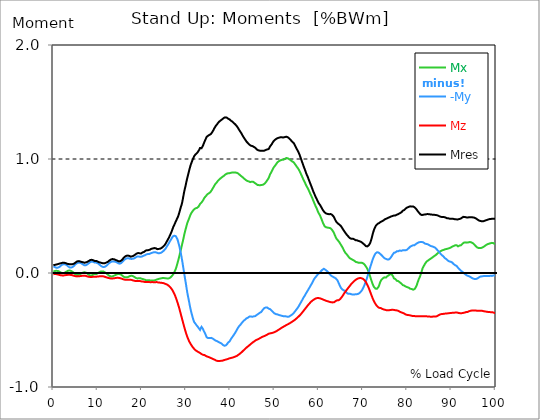
| Category |  Mx |  -My |  Mz |  Mres |
|---|---|---|---|---|
| 0.0 | 0.012 | 0.059 | -0.011 | 0.069 |
| 0.167348456675344 | 0.015 | 0.055 | -0.01 | 0.07 |
| 0.334696913350688 | 0.018 | 0.052 | -0.008 | 0.071 |
| 0.5020453700260321 | 0.019 | 0.049 | -0.01 | 0.073 |
| 0.669393826701376 | 0.019 | 0.046 | -0.01 | 0.074 |
| 0.83674228337672 | 0.02 | 0.045 | -0.011 | 0.074 |
| 1.0040907400520642 | 0.018 | 0.047 | -0.013 | 0.077 |
| 1.1621420602454444 | 0.016 | 0.049 | -0.015 | 0.081 |
| 1.3294905169207885 | 0.013 | 0.052 | -0.017 | 0.082 |
| 1.4968389735961325 | 0.008 | 0.058 | -0.019 | 0.083 |
| 1.6641874302714765 | 0.004 | 0.064 | -0.02 | 0.085 |
| 1.8315358869468206 | 0.001 | 0.069 | -0.021 | 0.087 |
| 1.9988843436221646 | -0.002 | 0.073 | -0.021 | 0.089 |
| 2.1662328002975086 | -0.002 | 0.075 | -0.021 | 0.09 |
| 2.333581256972853 | -0.001 | 0.077 | -0.021 | 0.09 |
| 2.5009297136481967 | 0.002 | 0.076 | -0.02 | 0.089 |
| 2.6682781703235405 | 0.005 | 0.076 | -0.019 | 0.088 |
| 2.8356266269988843 | 0.008 | 0.074 | -0.018 | 0.086 |
| 3.002975083674229 | 0.013 | 0.07 | -0.017 | 0.083 |
| 3.1703235403495724 | 0.017 | 0.066 | -0.016 | 0.081 |
| 3.337671997024917 | 0.02 | 0.058 | -0.016 | 0.079 |
| 3.4957233172182973 | 0.022 | 0.053 | -0.015 | 0.079 |
| 3.663071773893641 | 0.022 | 0.049 | -0.016 | 0.077 |
| 3.8304202305689854 | 0.021 | 0.047 | -0.016 | 0.076 |
| 3.997768687244329 | 0.018 | 0.048 | -0.017 | 0.076 |
| 4.165117143919673 | 0.015 | 0.05 | -0.019 | 0.076 |
| 4.332465600595017 | 0.011 | 0.052 | -0.02 | 0.077 |
| 4.499814057270361 | 0.005 | 0.057 | -0.022 | 0.08 |
| 4.667162513945706 | 0 | 0.063 | -0.024 | 0.082 |
| 4.834510970621049 | -0.006 | 0.069 | -0.025 | 0.087 |
| 5.001859427296393 | -0.012 | 0.076 | -0.028 | 0.091 |
| 5.169207883971737 | -0.015 | 0.081 | -0.029 | 0.097 |
| 5.336556340647081 | -0.017 | 0.086 | -0.03 | 0.101 |
| 5.503904797322425 | -0.018 | 0.089 | -0.03 | 0.103 |
| 5.671253253997769 | -0.017 | 0.091 | -0.029 | 0.104 |
| 5.82930457419115 | -0.014 | 0.09 | -0.029 | 0.103 |
| 5.996653030866494 | -0.011 | 0.089 | -0.028 | 0.102 |
| 6.164001487541838 | -0.007 | 0.087 | -0.027 | 0.1 |
| 6.331349944217181 | -0.003 | 0.085 | -0.025 | 0.098 |
| 6.498698400892526 | 0 | 0.081 | -0.024 | 0.096 |
| 6.66604685756787 | 0.003 | 0.075 | -0.023 | 0.094 |
| 6.833395314243213 | 0.005 | 0.071 | -0.023 | 0.092 |
| 7.000743770918558 | 0.006 | 0.068 | -0.023 | 0.09 |
| 7.168092227593902 | 0.006 | 0.067 | -0.024 | 0.09 |
| 7.335440684269246 | 0.004 | 0.068 | -0.025 | 0.092 |
| 7.50278914094459 | 0 | 0.071 | -0.028 | 0.094 |
| 7.6701375976199335 | -0.005 | 0.075 | -0.03 | 0.098 |
| 7.837486054295278 | -0.011 | 0.08 | -0.031 | 0.101 |
| 7.995537374488658 | -0.015 | 0.085 | -0.033 | 0.105 |
| 8.162885831164003 | -0.019 | 0.091 | -0.034 | 0.109 |
| 8.330234287839346 | -0.022 | 0.096 | -0.035 | 0.114 |
| 8.49758274451469 | -0.022 | 0.099 | -0.035 | 0.116 |
| 8.664931201190035 | -0.02 | 0.1 | -0.035 | 0.116 |
| 8.832279657865378 | -0.018 | 0.1 | -0.034 | 0.116 |
| 8.999628114540721 | -0.015 | 0.098 | -0.033 | 0.113 |
| 9.166976571216066 | -0.011 | 0.094 | -0.032 | 0.109 |
| 9.334325027891412 | -0.008 | 0.091 | -0.032 | 0.106 |
| 9.501673484566755 | -0.011 | 0.091 | -0.033 | 0.106 |
| 9.669021941242098 | -0.011 | 0.091 | -0.033 | 0.106 |
| 9.836370397917442 | -0.006 | 0.089 | -0.032 | 0.103 |
| 10.003718854592787 | -0.003 | 0.086 | -0.031 | 0.101 |
| 10.17106731126813 | 0.001 | 0.082 | -0.031 | 0.098 |
| 10.329118631461512 | 0.005 | 0.077 | -0.03 | 0.094 |
| 10.496467088136853 | 0.01 | 0.071 | -0.029 | 0.092 |
| 10.663815544812199 | 0.013 | 0.065 | -0.028 | 0.091 |
| 10.831164001487544 | 0.013 | 0.061 | -0.029 | 0.089 |
| 10.998512458162887 | 0.014 | 0.056 | -0.029 | 0.087 |
| 11.16586091483823 | 0.014 | 0.053 | -0.029 | 0.086 |
| 11.333209371513574 | 0.013 | 0.052 | -0.03 | 0.085 |
| 11.50055782818892 | 0.01 | 0.052 | -0.032 | 0.085 |
| 11.667906284864264 | 0.005 | 0.055 | -0.034 | 0.086 |
| 11.835254741539607 | 0.001 | 0.059 | -0.036 | 0.089 |
| 12.00260319821495 | -0.003 | 0.064 | -0.038 | 0.092 |
| 12.169951654890292 | -0.008 | 0.069 | -0.04 | 0.096 |
| 12.337300111565641 | -0.015 | 0.075 | -0.042 | 0.099 |
| 12.504648568240984 | -0.021 | 0.082 | -0.045 | 0.104 |
| 12.662699888434362 | -0.025 | 0.088 | -0.046 | 0.109 |
| 12.830048345109708 | -0.028 | 0.092 | -0.047 | 0.114 |
| 12.997396801785053 | -0.03 | 0.097 | -0.048 | 0.118 |
| 13.164745258460396 | -0.03 | 0.1 | -0.048 | 0.121 |
| 13.33209371513574 | -0.03 | 0.101 | -0.048 | 0.122 |
| 13.499442171811083 | -0.028 | 0.102 | -0.048 | 0.122 |
| 13.666790628486426 | -0.024 | 0.101 | -0.047 | 0.121 |
| 13.834139085161771 | -0.021 | 0.1 | -0.046 | 0.119 |
| 14.001487541837117 | -0.018 | 0.099 | -0.045 | 0.116 |
| 14.16883599851246 | -0.014 | 0.097 | -0.044 | 0.114 |
| 14.336184455187803 | -0.012 | 0.093 | -0.042 | 0.11 |
| 14.503532911863147 | -0.01 | 0.09 | -0.042 | 0.107 |
| 14.670881368538492 | -0.008 | 0.086 | -0.042 | 0.104 |
| 14.828932688731873 | -0.008 | 0.083 | -0.044 | 0.103 |
| 14.996281145407215 | -0.01 | 0.082 | -0.045 | 0.102 |
| 15.163629602082558 | -0.012 | 0.083 | -0.046 | 0.104 |
| 15.330978058757903 | -0.015 | 0.087 | -0.048 | 0.108 |
| 15.498326515433247 | -0.019 | 0.092 | -0.051 | 0.114 |
| 15.665674972108594 | -0.025 | 0.1 | -0.053 | 0.121 |
| 15.833023428783937 | -0.031 | 0.107 | -0.055 | 0.131 |
| 16.00037188545928 | -0.035 | 0.115 | -0.057 | 0.138 |
| 16.167720342134626 | -0.037 | 0.12 | -0.058 | 0.143 |
| 16.335068798809967 | -0.038 | 0.124 | -0.059 | 0.148 |
| 16.502417255485312 | -0.039 | 0.127 | -0.059 | 0.151 |
| 16.669765712160658 | -0.038 | 0.13 | -0.059 | 0.153 |
| 16.837114168836 | -0.036 | 0.131 | -0.059 | 0.153 |
| 17.004462625511344 | -0.033 | 0.13 | -0.059 | 0.152 |
| 17.16251394570472 | -0.03 | 0.128 | -0.059 | 0.15 |
| 17.32986240238007 | -0.027 | 0.125 | -0.059 | 0.146 |
| 17.497210859055414 | -0.024 | 0.122 | -0.059 | 0.143 |
| 17.664559315730756 | -0.023 | 0.123 | -0.061 | 0.144 |
| 17.8319077724061 | -0.025 | 0.124 | -0.063 | 0.146 |
| 17.999256229081443 | -0.028 | 0.125 | -0.065 | 0.15 |
| 18.166604685756788 | -0.031 | 0.127 | -0.066 | 0.152 |
| 18.333953142432133 | -0.035 | 0.13 | -0.068 | 0.156 |
| 18.501301599107478 | -0.04 | 0.134 | -0.07 | 0.161 |
| 18.668650055782823 | -0.044 | 0.138 | -0.071 | 0.166 |
| 18.835998512458165 | -0.047 | 0.142 | -0.071 | 0.171 |
| 19.00334696913351 | -0.048 | 0.145 | -0.071 | 0.174 |
| 19.170695425808855 | -0.047 | 0.146 | -0.071 | 0.175 |
| 19.338043882484197 | -0.046 | 0.144 | -0.071 | 0.173 |
| 19.496095202677576 | -0.046 | 0.144 | -0.071 | 0.173 |
| 19.66344365935292 | -0.046 | 0.142 | -0.071 | 0.172 |
| 19.830792116028263 | -0.047 | 0.141 | -0.072 | 0.171 |
| 19.998140572703612 | -0.051 | 0.144 | -0.074 | 0.176 |
| 20.165489029378953 | -0.053 | 0.149 | -0.075 | 0.18 |
| 20.3328374860543 | -0.054 | 0.151 | -0.075 | 0.184 |
| 20.500185942729644 | -0.054 | 0.151 | -0.076 | 0.185 |
| 20.667534399404985 | -0.058 | 0.155 | -0.079 | 0.19 |
| 20.83488285608033 | -0.062 | 0.159 | -0.079 | 0.195 |
| 21.002231312755672 | -0.064 | 0.162 | -0.08 | 0.199 |
| 21.16957976943102 | -0.064 | 0.166 | -0.08 | 0.201 |
| 21.336928226106362 | -0.063 | 0.167 | -0.08 | 0.202 |
| 21.504276682781704 | -0.062 | 0.167 | -0.08 | 0.201 |
| 21.67162513945705 | -0.063 | 0.167 | -0.08 | 0.202 |
| 21.82967645965043 | -0.065 | 0.17 | -0.081 | 0.205 |
| 21.997024916325774 | -0.067 | 0.173 | -0.081 | 0.209 |
| 22.16437337300112 | -0.067 | 0.175 | -0.081 | 0.212 |
| 22.33172182967646 | -0.067 | 0.177 | -0.08 | 0.214 |
| 22.499070286351806 | -0.067 | 0.179 | -0.08 | 0.215 |
| 22.666418743027148 | -0.066 | 0.182 | -0.081 | 0.217 |
| 22.833767199702496 | -0.065 | 0.184 | -0.081 | 0.219 |
| 23.00111565637784 | -0.064 | 0.183 | -0.081 | 0.218 |
| 23.168464113053183 | -0.063 | 0.183 | -0.081 | 0.217 |
| 23.335812569728528 | -0.057 | 0.179 | -0.08 | 0.212 |
| 23.50316102640387 | -0.055 | 0.176 | -0.081 | 0.209 |
| 23.670509483079215 | -0.054 | 0.174 | -0.083 | 0.21 |
| 23.83785793975456 | -0.052 | 0.174 | -0.084 | 0.211 |
| 23.995909259947936 | -0.05 | 0.174 | -0.084 | 0.212 |
| 24.163257716623285 | -0.048 | 0.175 | -0.085 | 0.213 |
| 24.330606173298627 | -0.047 | 0.177 | -0.086 | 0.217 |
| 24.49795462997397 | -0.046 | 0.182 | -0.087 | 0.221 |
| 24.665303086649313 | -0.045 | 0.186 | -0.087 | 0.225 |
| 24.83265154332466 | -0.045 | 0.191 | -0.089 | 0.231 |
| 25.0 | -0.045 | 0.197 | -0.09 | 0.238 |
| 25.167348456675345 | -0.046 | 0.204 | -0.092 | 0.245 |
| 25.334696913350694 | -0.046 | 0.212 | -0.096 | 0.255 |
| 25.502045370026035 | -0.047 | 0.222 | -0.099 | 0.265 |
| 25.669393826701377 | -0.048 | 0.234 | -0.101 | 0.278 |
| 25.836742283376722 | -0.048 | 0.243 | -0.105 | 0.289 |
| 26.004090740052067 | -0.048 | 0.254 | -0.109 | 0.301 |
| 26.17143919672741 | -0.046 | 0.264 | -0.116 | 0.313 |
| 26.329490516920792 | -0.044 | 0.277 | -0.121 | 0.329 |
| 26.49683897359613 | -0.038 | 0.288 | -0.127 | 0.342 |
| 26.66418743027148 | -0.032 | 0.296 | -0.136 | 0.357 |
| 26.831535886946828 | -0.024 | 0.309 | -0.145 | 0.374 |
| 26.998884343622166 | -0.017 | 0.321 | -0.156 | 0.392 |
| 27.166232800297514 | -0.007 | 0.327 | -0.169 | 0.409 |
| 27.333581256972852 | 0.005 | 0.327 | -0.182 | 0.421 |
| 27.5009297136482 | 0.019 | 0.326 | -0.196 | 0.436 |
| 27.668278170323543 | 0.035 | 0.324 | -0.213 | 0.451 |
| 27.835626626998888 | 0.054 | 0.315 | -0.231 | 0.465 |
| 28.002975083674233 | 0.077 | 0.3 | -0.251 | 0.48 |
| 28.170323540349575 | 0.101 | 0.281 | -0.271 | 0.493 |
| 28.33767199702492 | 0.126 | 0.257 | -0.292 | 0.512 |
| 28.50502045370026 | 0.152 | 0.234 | -0.314 | 0.533 |
| 28.663071773893645 | 0.179 | 0.202 | -0.339 | 0.556 |
| 28.830420230568986 | 0.206 | 0.171 | -0.363 | 0.58 |
| 28.99776868724433 | 0.232 | 0.136 | -0.387 | 0.599 |
| 29.165117143919673 | 0.261 | 0.099 | -0.412 | 0.626 |
| 29.33246560059502 | 0.289 | 0.057 | -0.436 | 0.661 |
| 29.499814057270367 | 0.318 | 0.017 | -0.461 | 0.696 |
| 29.66716251394571 | 0.348 | -0.024 | -0.484 | 0.728 |
| 29.834510970621054 | 0.374 | -0.064 | -0.506 | 0.755 |
| 30.00185942729639 | 0.398 | -0.102 | -0.528 | 0.785 |
| 30.169207883971744 | 0.423 | -0.144 | -0.548 | 0.815 |
| 30.33655634064708 | 0.444 | -0.183 | -0.565 | 0.842 |
| 30.50390479732243 | 0.46 | -0.214 | -0.581 | 0.866 |
| 30.671253253997772 | 0.477 | -0.247 | -0.596 | 0.894 |
| 30.829304574191156 | 0.494 | -0.282 | -0.608 | 0.918 |
| 30.996653030866494 | 0.511 | -0.314 | -0.62 | 0.942 |
| 31.164001487541842 | 0.523 | -0.342 | -0.631 | 0.961 |
| 31.331349944217187 | 0.534 | -0.366 | -0.64 | 0.978 |
| 31.498698400892525 | 0.544 | -0.391 | -0.65 | 0.995 |
| 31.666046857567874 | 0.552 | -0.412 | -0.658 | 1.01 |
| 31.833395314243212 | 0.558 | -0.43 | -0.666 | 1.024 |
| 32.00074377091856 | 0.563 | -0.435 | -0.673 | 1.033 |
| 32.1680922275939 | 0.568 | -0.447 | -0.678 | 1.041 |
| 32.33544068426925 | 0.569 | -0.456 | -0.683 | 1.047 |
| 32.50278914094459 | 0.571 | -0.465 | -0.687 | 1.053 |
| 32.670137597619934 | 0.574 | -0.472 | -0.69 | 1.061 |
| 32.83748605429528 | 0.583 | -0.482 | -0.694 | 1.071 |
| 33.004834510970625 | 0.593 | -0.49 | -0.697 | 1.083 |
| 33.162885831164004 | 0.606 | -0.499 | -0.702 | 1.097 |
| 33.33023428783935 | 0.613 | -0.484 | -0.706 | 1.094 |
| 33.497582744514695 | 0.618 | -0.472 | -0.711 | 1.094 |
| 33.664931201190036 | 0.625 | -0.472 | -0.715 | 1.101 |
| 33.83227965786538 | 0.637 | -0.492 | -0.718 | 1.118 |
| 33.99962811454073 | 0.65 | -0.507 | -0.719 | 1.136 |
| 34.16697657121607 | 0.66 | -0.52 | -0.72 | 1.151 |
| 34.33432502789141 | 0.668 | -0.532 | -0.725 | 1.166 |
| 34.50167348456676 | 0.675 | -0.549 | -0.728 | 1.18 |
| 34.6690219412421 | 0.684 | -0.564 | -0.731 | 1.194 |
| 34.83637039791744 | 0.691 | -0.571 | -0.734 | 1.203 |
| 35.00371885459279 | 0.694 | -0.571 | -0.736 | 1.205 |
| 35.17106731126814 | 0.7 | -0.571 | -0.738 | 1.209 |
| 35.338415767943474 | 0.705 | -0.571 | -0.741 | 1.212 |
| 35.49646708813686 | 0.709 | -0.571 | -0.744 | 1.215 |
| 35.6638155448122 | 0.717 | -0.569 | -0.746 | 1.221 |
| 35.831164001487544 | 0.728 | -0.569 | -0.749 | 1.229 |
| 35.998512458162885 | 0.74 | -0.574 | -0.753 | 1.241 |
| 36.165860914838234 | 0.751 | -0.576 | -0.756 | 1.252 |
| 36.333209371513576 | 0.762 | -0.584 | -0.758 | 1.265 |
| 36.50055782818892 | 0.773 | -0.587 | -0.761 | 1.276 |
| 36.667906284864266 | 0.782 | -0.592 | -0.765 | 1.288 |
| 36.83525474153961 | 0.79 | -0.596 | -0.769 | 1.296 |
| 37.002603198214956 | 0.797 | -0.598 | -0.771 | 1.304 |
| 37.1699516548903 | 0.807 | -0.602 | -0.772 | 1.313 |
| 37.337300111565646 | 0.814 | -0.605 | -0.773 | 1.321 |
| 37.50464856824098 | 0.821 | -0.609 | -0.772 | 1.328 |
| 37.66269988843437 | 0.826 | -0.611 | -0.772 | 1.333 |
| 37.83004834510971 | 0.831 | -0.615 | -0.771 | 1.339 |
| 37.99739680178505 | 0.837 | -0.618 | -0.77 | 1.343 |
| 38.16474525846039 | 0.842 | -0.621 | -0.77 | 1.348 |
| 38.33209371513574 | 0.846 | -0.631 | -0.766 | 1.355 |
| 38.49944217181109 | 0.85 | -0.636 | -0.765 | 1.359 |
| 38.666790628486424 | 0.857 | -0.638 | -0.763 | 1.363 |
| 38.83413908516178 | 0.862 | -0.638 | -0.761 | 1.365 |
| 39.001487541837115 | 0.867 | -0.635 | -0.76 | 1.365 |
| 39.16883599851246 | 0.87 | -0.63 | -0.758 | 1.364 |
| 39.336184455187805 | 0.873 | -0.621 | -0.756 | 1.36 |
| 39.503532911863154 | 0.875 | -0.61 | -0.754 | 1.355 |
| 39.670881368538495 | 0.874 | -0.607 | -0.751 | 1.35 |
| 39.83822982521384 | 0.876 | -0.601 | -0.748 | 1.347 |
| 39.996281145407224 | 0.877 | -0.589 | -0.746 | 1.341 |
| 40.163629602082565 | 0.879 | -0.579 | -0.745 | 1.335 |
| 40.33097805875791 | 0.881 | -0.569 | -0.744 | 1.331 |
| 40.498326515433256 | 0.882 | -0.559 | -0.742 | 1.327 |
| 40.6656749721086 | 0.881 | -0.551 | -0.74 | 1.321 |
| 40.83302342878393 | 0.881 | -0.541 | -0.738 | 1.314 |
| 41.00037188545929 | 0.88 | -0.531 | -0.736 | 1.308 |
| 41.16772034213463 | 0.881 | -0.521 | -0.732 | 1.303 |
| 41.33506879880997 | 0.88 | -0.51 | -0.73 | 1.295 |
| 41.50241725548531 | 0.879 | -0.497 | -0.727 | 1.287 |
| 41.66976571216066 | 0.877 | -0.486 | -0.723 | 1.278 |
| 41.837114168836 | 0.872 | -0.476 | -0.718 | 1.268 |
| 42.004462625511344 | 0.866 | -0.466 | -0.712 | 1.256 |
| 42.17181108218669 | 0.86 | -0.459 | -0.708 | 1.246 |
| 42.32986240238007 | 0.855 | -0.452 | -0.703 | 1.236 |
| 42.497210859055414 | 0.849 | -0.447 | -0.697 | 1.226 |
| 42.66455931573076 | 0.844 | -0.435 | -0.691 | 1.213 |
| 42.831907772406105 | 0.839 | -0.428 | -0.685 | 1.203 |
| 42.999256229081446 | 0.833 | -0.42 | -0.677 | 1.192 |
| 43.16660468575679 | 0.827 | -0.416 | -0.673 | 1.183 |
| 43.33395314243214 | 0.821 | -0.41 | -0.667 | 1.172 |
| 43.50130159910748 | 0.816 | -0.403 | -0.66 | 1.162 |
| 43.66865005578282 | 0.812 | -0.398 | -0.654 | 1.153 |
| 43.83599851245817 | 0.808 | -0.396 | -0.649 | 1.145 |
| 44.00334696913351 | 0.805 | -0.392 | -0.643 | 1.139 |
| 44.17069542580886 | 0.804 | -0.386 | -0.639 | 1.133 |
| 44.3380438824842 | 0.799 | -0.382 | -0.633 | 1.125 |
| 44.49609520267758 | 0.797 | -0.381 | -0.627 | 1.119 |
| 44.66344365935292 | 0.799 | -0.381 | -0.622 | 1.117 |
| 44.83079211602827 | 0.801 | -0.384 | -0.617 | 1.117 |
| 44.99814057270361 | 0.8 | -0.384 | -0.611 | 1.114 |
| 45.16548902937895 | 0.8 | -0.38 | -0.606 | 1.11 |
| 45.332837486054295 | 0.796 | -0.38 | -0.602 | 1.106 |
| 45.500185942729644 | 0.791 | -0.379 | -0.598 | 1.102 |
| 45.66753439940499 | 0.788 | -0.378 | -0.592 | 1.098 |
| 45.83488285608033 | 0.782 | -0.375 | -0.588 | 1.091 |
| 46.00223131275568 | 0.776 | -0.367 | -0.585 | 1.084 |
| 46.16957976943102 | 0.772 | -0.361 | -0.583 | 1.079 |
| 46.336928226106366 | 0.771 | -0.359 | -0.58 | 1.076 |
| 46.50427668278171 | 0.771 | -0.356 | -0.576 | 1.075 |
| 46.671625139457056 | 0.77 | -0.349 | -0.573 | 1.073 |
| 46.829676459650436 | 0.771 | -0.345 | -0.569 | 1.073 |
| 46.99702491632577 | 0.772 | -0.342 | -0.565 | 1.073 |
| 47.16437337300112 | 0.773 | -0.333 | -0.562 | 1.072 |
| 47.33172182967646 | 0.774 | -0.324 | -0.558 | 1.072 |
| 47.49907028635181 | 0.776 | -0.316 | -0.556 | 1.072 |
| 47.66641874302716 | 0.78 | -0.309 | -0.554 | 1.073 |
| 47.83376719970249 | 0.787 | -0.304 | -0.551 | 1.076 |
| 48.001115656377834 | 0.794 | -0.303 | -0.548 | 1.079 |
| 48.16846411305319 | 0.803 | -0.301 | -0.545 | 1.081 |
| 48.33581256972853 | 0.811 | -0.303 | -0.541 | 1.084 |
| 48.50316102640387 | 0.822 | -0.307 | -0.537 | 1.084 |
| 48.67050948307921 | 0.832 | -0.312 | -0.532 | 1.087 |
| 48.837857939754564 | 0.848 | -0.315 | -0.531 | 1.098 |
| 49.005206396429905 | 0.865 | -0.317 | -0.531 | 1.11 |
| 49.163257716623285 | 0.877 | -0.324 | -0.529 | 1.118 |
| 49.33060617329863 | 0.89 | -0.329 | -0.527 | 1.127 |
| 49.49795462997397 | 0.902 | -0.334 | -0.525 | 1.138 |
| 49.66530308664932 | 0.915 | -0.342 | -0.523 | 1.15 |
| 49.832651543324666 | 0.927 | -0.349 | -0.521 | 1.158 |
| 50.0 | 0.934 | -0.355 | -0.519 | 1.165 |
| 50.16734845667534 | 0.944 | -0.358 | -0.516 | 1.17 |
| 50.33469691335069 | 0.952 | -0.361 | -0.513 | 1.175 |
| 50.50204537002604 | 0.962 | -0.361 | -0.508 | 1.178 |
| 50.66939382670139 | 0.971 | -0.363 | -0.503 | 1.183 |
| 50.836742283376715 | 0.978 | -0.366 | -0.5 | 1.186 |
| 51.00409074005207 | 0.981 | -0.368 | -0.496 | 1.187 |
| 51.17143919672741 | 0.984 | -0.369 | -0.493 | 1.188 |
| 51.32949051692079 | 0.988 | -0.372 | -0.488 | 1.19 |
| 51.496838973596134 | 0.992 | -0.374 | -0.483 | 1.191 |
| 51.66418743027148 | 0.993 | -0.376 | -0.48 | 1.19 |
| 51.831535886946824 | 0.993 | -0.379 | -0.476 | 1.19 |
| 51.99888434362217 | 0.994 | -0.379 | -0.472 | 1.189 |
| 52.16623280029752 | 0.997 | -0.379 | -0.468 | 1.19 |
| 52.33358125697285 | 1.001 | -0.379 | -0.464 | 1.192 |
| 52.5009297136482 | 1.004 | -0.38 | -0.461 | 1.193 |
| 52.668278170323546 | 1.008 | -0.381 | -0.458 | 1.195 |
| 52.835626626998895 | 1.011 | -0.383 | -0.453 | 1.196 |
| 53.00297508367424 | 1.006 | -0.384 | -0.45 | 1.191 |
| 53.17032354034958 | 1.002 | -0.383 | -0.447 | 1.186 |
| 53.33767199702492 | 0.998 | -0.381 | -0.444 | 1.18 |
| 53.50502045370027 | 0.995 | -0.377 | -0.439 | 1.175 |
| 53.663071773893655 | 0.989 | -0.373 | -0.435 | 1.167 |
| 53.83042023056899 | 0.983 | -0.367 | -0.431 | 1.158 |
| 53.99776868724433 | 0.979 | -0.364 | -0.427 | 1.152 |
| 54.16511714391967 | 0.975 | -0.358 | -0.423 | 1.145 |
| 54.33246560059503 | 0.971 | -0.351 | -0.418 | 1.14 |
| 54.49981405727037 | 0.963 | -0.344 | -0.414 | 1.13 |
| 54.667162513945705 | 0.953 | -0.335 | -0.409 | 1.116 |
| 54.834510970621054 | 0.944 | -0.327 | -0.403 | 1.103 |
| 55.0018594272964 | 0.934 | -0.318 | -0.397 | 1.09 |
| 55.169207883971744 | 0.926 | -0.31 | -0.392 | 1.079 |
| 55.336556340647086 | 0.917 | -0.3 | -0.386 | 1.067 |
| 55.50390479732243 | 0.907 | -0.291 | -0.38 | 1.053 |
| 55.671253253997776 | 0.895 | -0.278 | -0.374 | 1.037 |
| 55.83860171067312 | 0.881 | -0.266 | -0.367 | 1.019 |
| 55.9966530308665 | 0.866 | -0.256 | -0.36 | 1.001 |
| 56.16400148754184 | 0.852 | -0.243 | -0.351 | 0.982 |
| 56.33134994421718 | 0.838 | -0.234 | -0.343 | 0.964 |
| 56.498698400892536 | 0.823 | -0.22 | -0.335 | 0.945 |
| 56.66604685756788 | 0.81 | -0.209 | -0.327 | 0.928 |
| 56.83339531424321 | 0.797 | -0.2 | -0.318 | 0.911 |
| 57.00074377091856 | 0.782 | -0.188 | -0.311 | 0.893 |
| 57.16809222759391 | 0.769 | -0.176 | -0.303 | 0.875 |
| 57.33544068426925 | 0.756 | -0.166 | -0.294 | 0.859 |
| 57.5027891409446 | 0.745 | -0.157 | -0.286 | 0.845 |
| 57.670137597619934 | 0.731 | -0.144 | -0.278 | 0.827 |
| 57.83748605429528 | 0.718 | -0.133 | -0.271 | 0.811 |
| 58.004834510970625 | 0.703 | -0.122 | -0.263 | 0.794 |
| 58.16288583116401 | 0.689 | -0.11 | -0.256 | 0.777 |
| 58.330234287839346 | 0.675 | -0.1 | -0.249 | 0.761 |
| 58.497582744514695 | 0.66 | -0.088 | -0.244 | 0.744 |
| 58.66493120119004 | 0.644 | -0.075 | -0.239 | 0.726 |
| 58.832279657865385 | 0.628 | -0.062 | -0.235 | 0.709 |
| 58.999628114540734 | 0.614 | -0.051 | -0.23 | 0.695 |
| 59.16697657121607 | 0.598 | -0.041 | -0.227 | 0.679 |
| 59.33432502789142 | 0.583 | -0.033 | -0.224 | 0.665 |
| 59.50167348456676 | 0.57 | -0.027 | -0.221 | 0.653 |
| 59.66902194124211 | 0.554 | -0.018 | -0.22 | 0.638 |
| 59.83637039791745 | 0.537 | -0.011 | -0.22 | 0.624 |
| 60.00371885459278 | 0.523 | -0.004 | -0.22 | 0.613 |
| 60.17106731126813 | 0.514 | 0 | -0.221 | 0.605 |
| 60.33841576794349 | 0.5 | 0.008 | -0.223 | 0.594 |
| 60.49646708813685 | 0.485 | 0.016 | -0.225 | 0.583 |
| 60.6638155448122 | 0.469 | 0.022 | -0.227 | 0.572 |
| 60.831164001487544 | 0.452 | 0.029 | -0.23 | 0.559 |
| 60.99851245816289 | 0.436 | 0.034 | -0.232 | 0.549 |
| 61.16586091483824 | 0.423 | 0.037 | -0.236 | 0.54 |
| 61.333209371513576 | 0.41 | 0.035 | -0.239 | 0.532 |
| 61.50055782818892 | 0.403 | 0.029 | -0.241 | 0.524 |
| 61.667906284864266 | 0.401 | 0.022 | -0.243 | 0.522 |
| 61.835254741539615 | 0.4 | 0.018 | -0.246 | 0.521 |
| 62.002603198214956 | 0.398 | 0.014 | -0.247 | 0.518 |
| 62.16995165489029 | 0.397 | 0.006 | -0.249 | 0.517 |
| 62.33730011156564 | 0.396 | -0.002 | -0.252 | 0.516 |
| 62.504648568240995 | 0.395 | -0.012 | -0.254 | 0.516 |
| 62.67199702491633 | 0.393 | -0.019 | -0.256 | 0.517 |
| 62.83004834510971 | 0.385 | -0.024 | -0.257 | 0.514 |
| 62.99739680178505 | 0.379 | -0.029 | -0.258 | 0.511 |
| 63.1647452584604 | 0.37 | -0.032 | -0.258 | 0.504 |
| 63.33209371513575 | 0.36 | -0.037 | -0.257 | 0.497 |
| 63.4994421718111 | 0.346 | -0.039 | -0.256 | 0.486 |
| 63.666790628486424 | 0.33 | -0.042 | -0.251 | 0.471 |
| 63.83413908516177 | 0.315 | -0.047 | -0.246 | 0.459 |
| 64.00148754183712 | 0.301 | -0.053 | -0.242 | 0.448 |
| 64.16883599851248 | 0.293 | -0.061 | -0.24 | 0.441 |
| 64.3361844551878 | 0.287 | -0.073 | -0.24 | 0.434 |
| 64.50353291186315 | 0.279 | -0.087 | -0.239 | 0.43 |
| 64.6708813685385 | 0.27 | -0.102 | -0.236 | 0.425 |
| 64.83822982521384 | 0.259 | -0.117 | -0.229 | 0.419 |
| 65.00557828188919 | 0.248 | -0.13 | -0.222 | 0.413 |
| 65.16362960208257 | 0.238 | -0.138 | -0.213 | 0.404 |
| 65.3309780587579 | 0.227 | -0.144 | -0.205 | 0.394 |
| 65.49832651543326 | 0.215 | -0.149 | -0.195 | 0.382 |
| 65.6656749721086 | 0.202 | -0.153 | -0.184 | 0.373 |
| 65.83302342878395 | 0.189 | -0.155 | -0.174 | 0.363 |
| 66.00037188545929 | 0.178 | -0.156 | -0.166 | 0.354 |
| 66.16772034213463 | 0.17 | -0.162 | -0.157 | 0.345 |
| 66.33506879880998 | 0.163 | -0.174 | -0.148 | 0.337 |
| 66.50241725548531 | 0.155 | -0.179 | -0.139 | 0.329 |
| 66.66976571216065 | 0.146 | -0.183 | -0.131 | 0.322 |
| 66.83711416883601 | 0.138 | -0.184 | -0.122 | 0.314 |
| 67.00446262551135 | 0.131 | -0.182 | -0.115 | 0.307 |
| 67.1718110821867 | 0.124 | -0.183 | -0.106 | 0.303 |
| 67.32986240238007 | 0.123 | -0.186 | -0.098 | 0.3 |
| 67.49721085905541 | 0.121 | -0.189 | -0.089 | 0.301 |
| 67.66455931573076 | 0.116 | -0.189 | -0.084 | 0.301 |
| 67.83190777240611 | 0.11 | -0.189 | -0.077 | 0.298 |
| 67.99925622908145 | 0.109 | -0.189 | -0.071 | 0.296 |
| 68.16660468575678 | 0.104 | -0.188 | -0.066 | 0.292 |
| 68.33395314243214 | 0.098 | -0.186 | -0.061 | 0.288 |
| 68.50130159910749 | 0.094 | -0.187 | -0.056 | 0.287 |
| 68.66865005578282 | 0.094 | -0.186 | -0.052 | 0.287 |
| 68.83599851245816 | 0.09 | -0.184 | -0.049 | 0.282 |
| 69.00334696913352 | 0.09 | -0.182 | -0.047 | 0.281 |
| 69.17069542580886 | 0.089 | -0.177 | -0.045 | 0.279 |
| 69.3380438824842 | 0.089 | -0.172 | -0.044 | 0.277 |
| 69.50539233915956 | 0.09 | -0.166 | -0.044 | 0.274 |
| 69.66344365935292 | 0.09 | -0.157 | -0.046 | 0.271 |
| 69.83079211602826 | 0.088 | -0.148 | -0.047 | 0.264 |
| 69.99814057270362 | 0.086 | -0.134 | -0.051 | 0.26 |
| 70.16548902937896 | 0.082 | -0.121 | -0.055 | 0.256 |
| 70.33283748605429 | 0.075 | -0.107 | -0.062 | 0.249 |
| 70.50018594272964 | 0.067 | -0.089 | -0.07 | 0.242 |
| 70.667534399405 | 0.057 | -0.072 | -0.08 | 0.236 |
| 70.83488285608033 | 0.047 | -0.053 | -0.091 | 0.234 |
| 71.00223131275568 | 0.035 | -0.033 | -0.105 | 0.234 |
| 71.16957976943102 | 0.02 | -0.011 | -0.119 | 0.236 |
| 71.33692822610637 | 0.003 | 0.011 | -0.134 | 0.244 |
| 71.50427668278171 | -0.015 | 0.032 | -0.151 | 0.255 |
| 71.67162513945706 | -0.035 | 0.054 | -0.168 | 0.266 |
| 71.8389735961324 | -0.057 | 0.074 | -0.186 | 0.287 |
| 71.99702491632577 | -0.075 | 0.094 | -0.202 | 0.309 |
| 72.16437337300113 | -0.094 | 0.115 | -0.22 | 0.337 |
| 72.33172182967647 | -0.109 | 0.132 | -0.235 | 0.359 |
| 72.49907028635181 | -0.122 | 0.148 | -0.247 | 0.379 |
| 72.66641874302715 | -0.131 | 0.16 | -0.26 | 0.395 |
| 72.8337671997025 | -0.137 | 0.171 | -0.272 | 0.409 |
| 73.00111565637783 | -0.139 | 0.177 | -0.281 | 0.419 |
| 73.16846411305319 | -0.138 | 0.182 | -0.29 | 0.427 |
| 73.33581256972853 | -0.135 | 0.183 | -0.296 | 0.432 |
| 73.50316102640387 | -0.123 | 0.18 | -0.301 | 0.435 |
| 73.67050948307921 | -0.108 | 0.177 | -0.306 | 0.438 |
| 73.83785793975457 | -0.087 | 0.17 | -0.306 | 0.444 |
| 74.00520639642991 | -0.071 | 0.163 | -0.307 | 0.448 |
| 74.16325771662328 | -0.061 | 0.158 | -0.311 | 0.451 |
| 74.33060617329863 | -0.052 | 0.153 | -0.314 | 0.454 |
| 74.49795462997398 | -0.047 | 0.144 | -0.317 | 0.458 |
| 74.66530308664932 | -0.042 | 0.137 | -0.32 | 0.462 |
| 74.83265154332466 | -0.038 | 0.131 | -0.322 | 0.467 |
| 75.00000000000001 | -0.037 | 0.126 | -0.323 | 0.472 |
| 75.16734845667534 | -0.04 | 0.124 | -0.325 | 0.476 |
| 75.3346969133507 | -0.034 | 0.121 | -0.327 | 0.477 |
| 75.50204537002605 | -0.029 | 0.119 | -0.327 | 0.481 |
| 75.66939382670138 | -0.023 | 0.116 | -0.327 | 0.484 |
| 75.83674228337672 | -0.019 | 0.118 | -0.326 | 0.487 |
| 76.00409074005208 | -0.014 | 0.121 | -0.326 | 0.489 |
| 76.17143919672742 | -0.011 | 0.13 | -0.325 | 0.493 |
| 76.33878765340276 | -0.008 | 0.138 | -0.324 | 0.496 |
| 76.49683897359614 | -0.012 | 0.148 | -0.323 | 0.498 |
| 76.66418743027148 | -0.018 | 0.158 | -0.323 | 0.5 |
| 76.83153588694682 | -0.031 | 0.168 | -0.323 | 0.502 |
| 76.99888434362218 | -0.047 | 0.177 | -0.324 | 0.504 |
| 77.16623280029752 | -0.047 | 0.175 | -0.327 | 0.502 |
| 77.33358125697285 | -0.053 | 0.18 | -0.327 | 0.505 |
| 77.5009297136482 | -0.058 | 0.187 | -0.327 | 0.508 |
| 77.66827817032356 | -0.068 | 0.191 | -0.328 | 0.512 |
| 77.83562662699889 | -0.073 | 0.193 | -0.329 | 0.515 |
| 78.00297508367423 | -0.071 | 0.191 | -0.332 | 0.517 |
| 78.17032354034959 | -0.076 | 0.196 | -0.335 | 0.522 |
| 78.33767199702493 | -0.082 | 0.197 | -0.34 | 0.524 |
| 78.50502045370027 | -0.085 | 0.194 | -0.343 | 0.528 |
| 78.67236891037561 | -0.092 | 0.194 | -0.345 | 0.532 |
| 78.83042023056899 | -0.1 | 0.196 | -0.348 | 0.538 |
| 78.99776868724433 | -0.106 | 0.2 | -0.35 | 0.546 |
| 79.16511714391969 | -0.108 | 0.199 | -0.354 | 0.548 |
| 79.33246560059503 | -0.11 | 0.199 | -0.356 | 0.552 |
| 79.49981405727036 | -0.114 | 0.199 | -0.359 | 0.557 |
| 79.66716251394571 | -0.119 | 0.2 | -0.364 | 0.566 |
| 79.83451097062107 | -0.123 | 0.202 | -0.366 | 0.571 |
| 80.00185942729641 | -0.124 | 0.205 | -0.367 | 0.574 |
| 80.16920788397174 | -0.127 | 0.211 | -0.368 | 0.577 |
| 80.33655634064709 | -0.128 | 0.218 | -0.369 | 0.58 |
| 80.50390479732243 | -0.136 | 0.225 | -0.369 | 0.583 |
| 80.67125325399778 | -0.138 | 0.23 | -0.372 | 0.585 |
| 80.83860171067312 | -0.138 | 0.234 | -0.374 | 0.583 |
| 80.99665303086651 | -0.14 | 0.238 | -0.375 | 0.583 |
| 81.16400148754184 | -0.146 | 0.241 | -0.376 | 0.585 |
| 81.3313499442172 | -0.146 | 0.243 | -0.378 | 0.584 |
| 81.49869840089255 | -0.146 | 0.243 | -0.378 | 0.582 |
| 81.66604685756786 | -0.141 | 0.244 | -0.378 | 0.576 |
| 81.83339531424322 | -0.132 | 0.248 | -0.379 | 0.57 |
| 82.00074377091858 | -0.121 | 0.255 | -0.38 | 0.564 |
| 82.16809222759392 | -0.107 | 0.26 | -0.38 | 0.555 |
| 82.33544068426926 | -0.086 | 0.263 | -0.38 | 0.546 |
| 82.50278914094459 | -0.068 | 0.266 | -0.38 | 0.537 |
| 82.67013759761994 | -0.05 | 0.27 | -0.38 | 0.529 |
| 82.83748605429528 | -0.037 | 0.272 | -0.38 | 0.521 |
| 83.00483451097062 | -0.019 | 0.272 | -0.38 | 0.515 |
| 83.17218296764597 | 0 | 0.271 | -0.379 | 0.51 |
| 83.33023428783935 | 0.021 | 0.272 | -0.38 | 0.508 |
| 83.4975827445147 | 0.044 | 0.272 | -0.381 | 0.512 |
| 83.66493120119004 | 0.055 | 0.269 | -0.38 | 0.512 |
| 83.83227965786537 | 0.067 | 0.262 | -0.38 | 0.513 |
| 83.99962811454073 | 0.079 | 0.258 | -0.38 | 0.513 |
| 84.16697657121607 | 0.089 | 0.256 | -0.38 | 0.515 |
| 84.33432502789142 | 0.097 | 0.255 | -0.38 | 0.516 |
| 84.50167348456677 | 0.104 | 0.255 | -0.38 | 0.517 |
| 84.6690219412421 | 0.108 | 0.252 | -0.381 | 0.517 |
| 84.83637039791745 | 0.113 | 0.248 | -0.382 | 0.516 |
| 85.0037188545928 | 0.118 | 0.244 | -0.382 | 0.515 |
| 85.17106731126813 | 0.122 | 0.241 | -0.382 | 0.515 |
| 85.33841576794349 | 0.127 | 0.237 | -0.383 | 0.514 |
| 85.50576422461883 | 0.131 | 0.236 | -0.383 | 0.513 |
| 85.66381554481221 | 0.135 | 0.234 | -0.383 | 0.512 |
| 85.83116400148755 | 0.14 | 0.23 | -0.382 | 0.512 |
| 85.99851245816289 | 0.145 | 0.228 | -0.381 | 0.511 |
| 86.16586091483823 | 0.15 | 0.225 | -0.382 | 0.511 |
| 86.33320937151358 | 0.153 | 0.222 | -0.382 | 0.51 |
| 86.50055782818893 | 0.158 | 0.217 | -0.381 | 0.508 |
| 86.66790628486427 | 0.165 | 0.208 | -0.38 | 0.507 |
| 86.83525474153961 | 0.171 | 0.201 | -0.378 | 0.505 |
| 87.00260319821496 | 0.177 | 0.194 | -0.373 | 0.503 |
| 87.16995165489031 | 0.183 | 0.188 | -0.367 | 0.499 |
| 87.33730011156564 | 0.185 | 0.18 | -0.365 | 0.497 |
| 87.504648568241 | 0.19 | 0.171 | -0.363 | 0.495 |
| 87.67199702491634 | 0.194 | 0.163 | -0.361 | 0.493 |
| 87.83004834510972 | 0.197 | 0.157 | -0.36 | 0.492 |
| 87.99739680178506 | 0.2 | 0.152 | -0.36 | 0.49 |
| 88.1647452584604 | 0.202 | 0.146 | -0.359 | 0.49 |
| 88.33209371513574 | 0.204 | 0.139 | -0.358 | 0.49 |
| 88.49944217181108 | 0.207 | 0.132 | -0.357 | 0.488 |
| 88.66679062848644 | 0.208 | 0.127 | -0.356 | 0.487 |
| 88.83413908516178 | 0.21 | 0.122 | -0.356 | 0.484 |
| 89.00148754183712 | 0.212 | 0.116 | -0.355 | 0.48 |
| 89.16883599851246 | 0.213 | 0.11 | -0.354 | 0.48 |
| 89.33618445518782 | 0.214 | 0.108 | -0.354 | 0.48 |
| 89.50353291186315 | 0.218 | 0.102 | -0.352 | 0.477 |
| 89.6708813685385 | 0.22 | 0.1 | -0.351 | 0.476 |
| 89.83822982521386 | 0.223 | 0.099 | -0.351 | 0.476 |
| 90.00557828188919 | 0.227 | 0.097 | -0.35 | 0.476 |
| 90.16362960208257 | 0.231 | 0.092 | -0.348 | 0.476 |
| 90.3309780587579 | 0.235 | 0.085 | -0.348 | 0.476 |
| 90.49832651543326 | 0.237 | 0.079 | -0.347 | 0.473 |
| 90.66567497210859 | 0.24 | 0.073 | -0.348 | 0.472 |
| 90.83302342878395 | 0.243 | 0.069 | -0.348 | 0.472 |
| 91.00037188545929 | 0.244 | 0.067 | -0.346 | 0.471 |
| 91.16772034213463 | 0.244 | 0.063 | -0.345 | 0.47 |
| 91.33506879880998 | 0.239 | 0.054 | -0.347 | 0.469 |
| 91.50241725548533 | 0.234 | 0.046 | -0.349 | 0.47 |
| 91.66976571216065 | 0.234 | 0.039 | -0.351 | 0.472 |
| 91.83711416883601 | 0.241 | 0.032 | -0.352 | 0.478 |
| 92.00446262551137 | 0.239 | 0.027 | -0.352 | 0.476 |
| 92.1718110821867 | 0.243 | 0.02 | -0.352 | 0.478 |
| 92.33915953886203 | 0.251 | 0.015 | -0.352 | 0.483 |
| 92.49721085905541 | 0.257 | 0.01 | -0.351 | 0.487 |
| 92.66455931573077 | 0.264 | 0.004 | -0.35 | 0.493 |
| 92.83190777240611 | 0.266 | -0.001 | -0.348 | 0.493 |
| 92.99925622908145 | 0.269 | -0.007 | -0.347 | 0.492 |
| 93.1666046857568 | 0.269 | -0.013 | -0.344 | 0.489 |
| 93.33395314243214 | 0.266 | -0.018 | -0.343 | 0.488 |
| 93.50130159910749 | 0.266 | -0.021 | -0.342 | 0.486 |
| 93.66865005578283 | 0.266 | -0.023 | -0.342 | 0.486 |
| 93.83599851245818 | 0.269 | -0.027 | -0.339 | 0.488 |
| 94.00334696913353 | 0.272 | -0.028 | -0.335 | 0.489 |
| 94.17069542580886 | 0.272 | -0.032 | -0.333 | 0.489 |
| 94.3380438824842 | 0.271 | -0.036 | -0.331 | 0.488 |
| 94.50539233915954 | 0.269 | -0.04 | -0.33 | 0.488 |
| 94.66344365935292 | 0.266 | -0.045 | -0.329 | 0.488 |
| 94.83079211602828 | 0.262 | -0.048 | -0.329 | 0.488 |
| 94.99814057270362 | 0.257 | -0.051 | -0.329 | 0.487 |
| 95.16548902937897 | 0.251 | -0.052 | -0.329 | 0.485 |
| 95.33283748605432 | 0.243 | -0.053 | -0.329 | 0.483 |
| 95.50018594272963 | 0.236 | -0.053 | -0.329 | 0.479 |
| 95.66753439940499 | 0.229 | -0.052 | -0.33 | 0.476 |
| 95.83488285608034 | 0.224 | -0.049 | -0.331 | 0.47 |
| 96.00223131275567 | 0.221 | -0.045 | -0.331 | 0.466 |
| 96.16957976943102 | 0.219 | -0.04 | -0.331 | 0.462 |
| 96.33692822610638 | 0.219 | -0.036 | -0.331 | 0.459 |
| 96.50427668278171 | 0.219 | -0.032 | -0.331 | 0.455 |
| 96.67162513945706 | 0.22 | -0.031 | -0.331 | 0.455 |
| 96.8389735961324 | 0.221 | -0.03 | -0.331 | 0.454 |
| 96.99702491632577 | 0.224 | -0.029 | -0.332 | 0.453 |
| 97.16437337300111 | 0.227 | -0.028 | -0.333 | 0.454 |
| 97.33172182967647 | 0.231 | -0.028 | -0.335 | 0.455 |
| 97.49907028635181 | 0.236 | -0.027 | -0.337 | 0.459 |
| 97.66641874302715 | 0.24 | -0.027 | -0.338 | 0.461 |
| 97.8337671997025 | 0.245 | -0.025 | -0.34 | 0.463 |
| 98.00111565637785 | 0.249 | -0.027 | -0.34 | 0.465 |
| 98.16846411305319 | 0.253 | -0.027 | -0.341 | 0.467 |
| 98.33581256972855 | 0.256 | -0.027 | -0.342 | 0.469 |
| 98.50316102640389 | 0.257 | -0.027 | -0.343 | 0.471 |
| 98.67050948307921 | 0.259 | -0.025 | -0.343 | 0.473 |
| 98.83785793975456 | 0.261 | -0.024 | -0.344 | 0.473 |
| 99.0052063964299 | 0.261 | -0.024 | -0.344 | 0.475 |
| 99.17255485310525 | 0.264 | -0.025 | -0.344 | 0.477 |
| 99.33060617329863 | 0.264 | -0.022 | -0.345 | 0.477 |
| 99.49795462997399 | 0.262 | -0.021 | -0.347 | 0.477 |
| 99.66530308664933 | 0.257 | -0.023 | -0.349 | 0.476 |
| 99.83265154332467 | 0.253 | -0.023 | -0.35 | 0.476 |
| 100.0 | 0.252 | -0.025 | -0.352 | 0.476 |